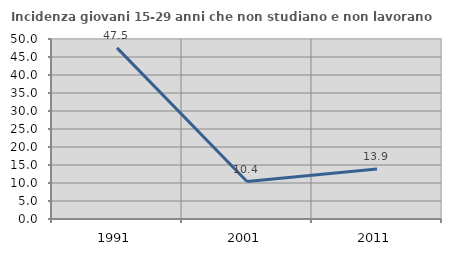
| Category | Incidenza giovani 15-29 anni che non studiano e non lavorano  |
|---|---|
| 1991.0 | 47.527 |
| 2001.0 | 10.406 |
| 2011.0 | 13.874 |